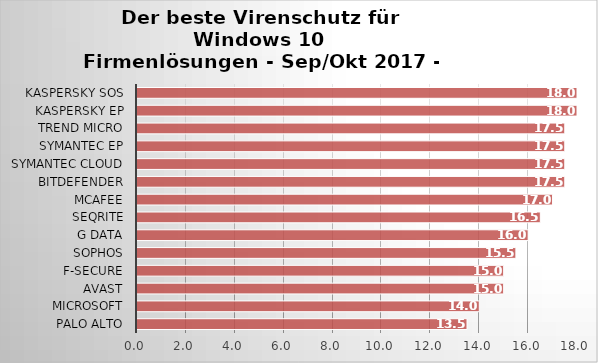
| Category | Series 0 |
|---|---|
| Palo Alto | 13.5 |
| Microsoft | 14 |
| Avast | 15 |
| F-Secure | 15 |
| Sophos | 15.5 |
| G Data | 16 |
| Seqrite | 16.5 |
| McAfee | 17 |
| Bitdefender | 17.5 |
| Symantec Cloud | 17.5 |
| Symantec EP | 17.5 |
| Trend Micro | 17.5 |
| Kaspersky EP | 18 |
| Kaspersky SOS | 18 |